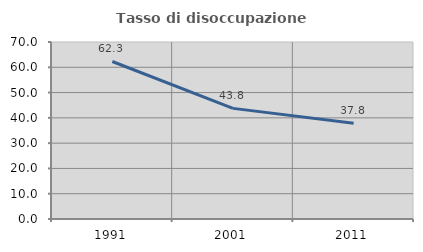
| Category | Tasso di disoccupazione giovanile  |
|---|---|
| 1991.0 | 62.295 |
| 2001.0 | 43.75 |
| 2011.0 | 37.838 |